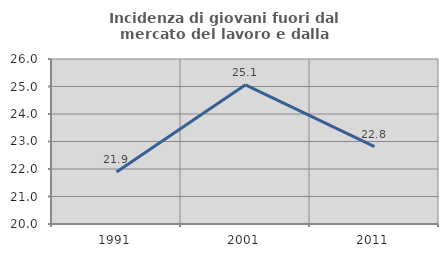
| Category | Incidenza di giovani fuori dal mercato del lavoro e dalla formazione  |
|---|---|
| 1991.0 | 21.887 |
| 2001.0 | 25.061 |
| 2011.0 | 22.812 |